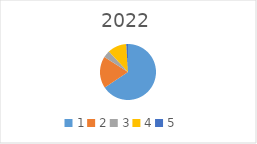
| Category | Series 0 |
|---|---|
| 1.0 | 589284.64 |
| 2.0 | 164686.27 |
| 3.0 | 36446.61 |
| 4.0 | 98222.14 |
| 5.0 | 8900 |